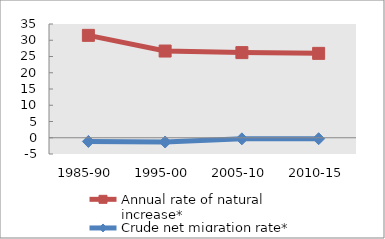
| Category | Annual rate of natural increase* | Crude net migration rate* |
|---|---|---|
| 1985-90 | 31.509 | -1.136 |
| 1995-00 | 26.68 | -1.312 |
| 2005-10 | 26.195 | -0.337 |
| 2010-15 | 25.964 | -0.297 |